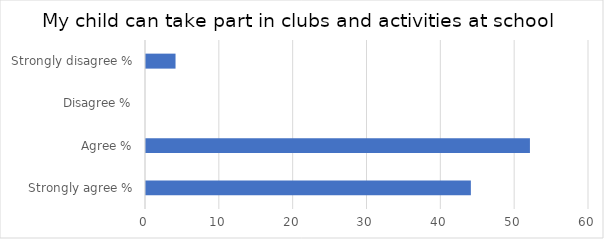
| Category | Series 1 |
|---|---|
| Strongly agree % | 44 |
| Agree % | 52 |
| Disagree % | 0 |
| Strongly disagree % | 4 |